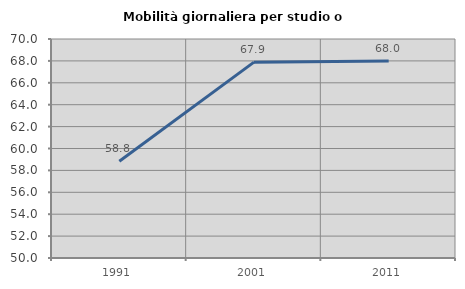
| Category | Mobilità giornaliera per studio o lavoro |
|---|---|
| 1991.0 | 58.835 |
| 2001.0 | 67.887 |
| 2011.0 | 67.981 |